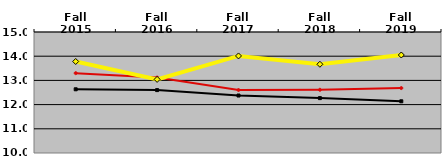
| Category | NATIONAL MEDIAN | WEST MEDIAN | TEXAS LUTHERAN |
|---|---|---|---|
| Fall 2015 | 12.633 | 13.3 | 13.781 |
| Fall 2016 | 12.599 | 13.115 | 13.042 |
| Fall 2017 | 12.375 | 12.603 | 14.01 |
| Fall 2018 | 12.268 | 12.612 | 13.667 |
| Fall 2019 | 12.137 | 12.684 | 14.049 |